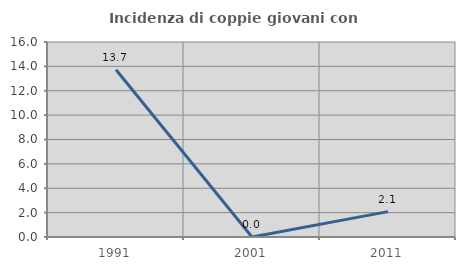
| Category | Incidenza di coppie giovani con figli |
|---|---|
| 1991.0 | 13.725 |
| 2001.0 | 0 |
| 2011.0 | 2.083 |